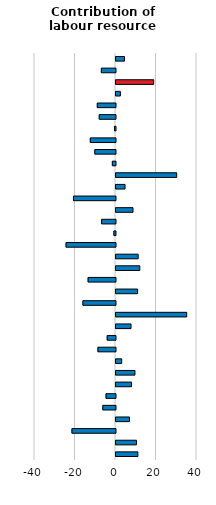
| Category | Contribution of labour resource utilisation² |
|---|---|
| MEX | 10.808 |
| CHL | 10.105 |
| TUR | -21.502 |
| LVA | 6.674 |
| GRC | -6.277 |
| HUN | -4.681 |
| POL | 7.651 |
| EST | 9.361 |
| PRT | 2.807 |
| SVK | -8.675 |
| SVN | -4.1 |
| CZE | 7.418 |
| KOR | 34.911 |
| ESP | -16.09 |
| ISR | 10.677 |
| ITA | -13.521 |
| NZL | 11.765 |
| JPN | 10.944 |
| FRA | -24.411 |
| GBR | -0.795 |
| FIN | -6.87 |
| CAN | 8.402 |
| BEL | -20.749 |
| AUS | 4.473 |
| ISL | 29.965 |
| SWE | -1.556 |
| DEU | -10.22 |
| DNK | -12.44 |
| AUT | -0.448 |
| NLD | -8.036 |
| NOR | -8.99 |
| USA | 2.159 |
| CHE | 18.615 |
| IRL | -6.981 |
| LUX | 4.191 |